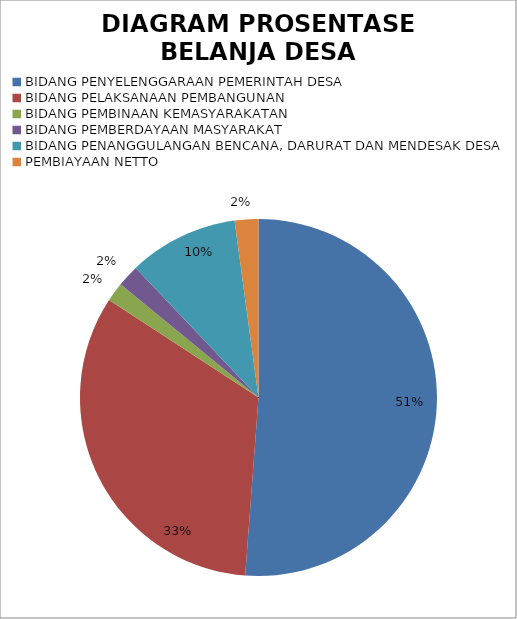
| Category | Series 0 | Series 1 | Series 2 |
|---|---|---|---|
| BIDANG PENYELENGGARAAN PEMERINTAH DESA | 835666000 | 870818467.19 | 35152467.19 |
| BIDANG PELAKSANAAN PEMBANGUNAN | 539022000 | 441605000 | -97417000 |
| BIDANG PEMBINAAN KEMASYARAKATAN | 28241350 | 24845850 | -3395500 |
| BIDANG PEMBERDAYAAN MASYARAKAT | 32554250 | 44918750 | 12364500 |
| BIDANG PENANGGULANGAN BENCANA, DARURAT DAN MENDESAK DESA | 162000000 | 399600000 | 237600000 |
| PEMBIAYAAN NETTO | -35000000 | -26197532.81 | 8802467.19 |